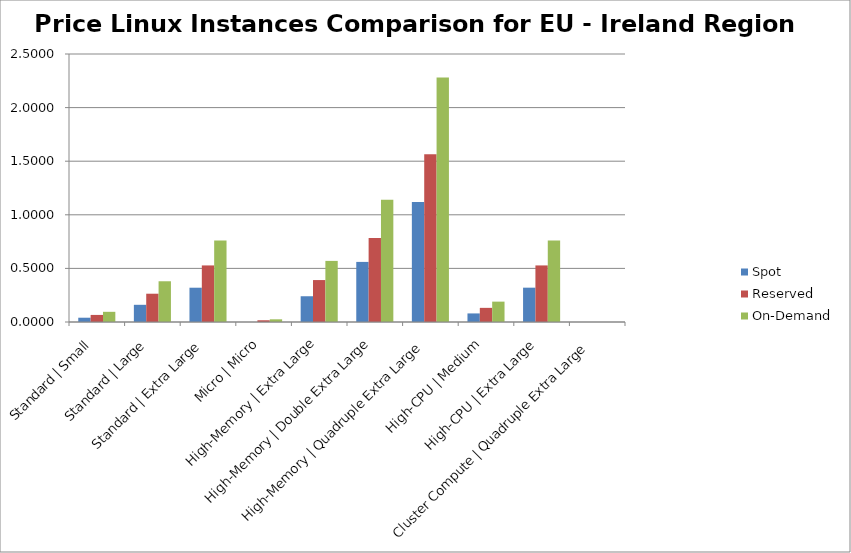
| Category | Spot | Reserved | On-Demand |
|---|---|---|---|
| Standard | Small | 0.04 | 0.066 | 0.095 |
| Standard | Large | 0.16 | 0.264 | 0.38 |
| Standard | Extra Large | 0.32 | 0.528 | 0.76 |
| Micro | Micro | 0 | 0.016 | 0.025 |
| High-Memory | Extra Large | 0.24 | 0.391 | 0.57 |
| High-Memory | Double Extra Large | 0.561 | 0.783 | 1.14 |
| High-Memory | Quadruple Extra Large | 1.12 | 1.565 | 2.28 |
| High-CPU | Medium | 0.08 | 0.132 | 0.19 |
| High-CPU | Extra Large | 0.32 | 0.528 | 0.76 |
| Cluster Compute | Quadruple Extra Large | 0 | 0 | 0 |